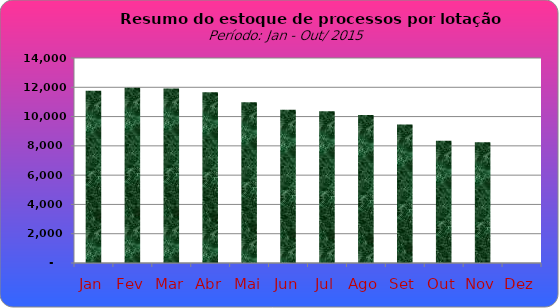
| Category | Series 0 |
|---|---|
| Jan | 11768 |
| Fev | 11973 |
| Mar | 11918 |
| Abr | 11669 |
| Mai | 10977 |
| Jun | 10462 |
| Jul | 10364 |
| Ago | 10110 |
| Set | 9465 |
| Out | 8346 |
| Nov | 8241 |
| Dez | 0 |